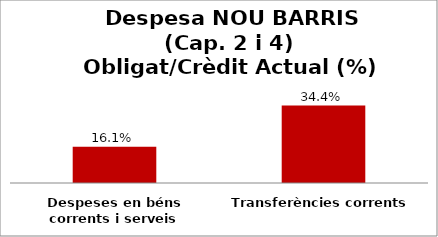
| Category | Series 0 |
|---|---|
| Despeses en béns corrents i serveis | 0.161 |
| Transferències corrents | 0.344 |